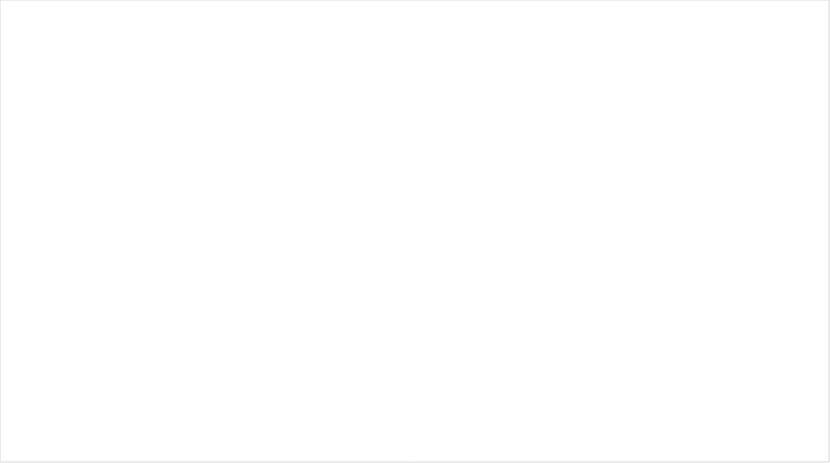
| Category |  APROPIACION
 VIGENTE |  COMPROMISOS
 ACUMULADOS |  OBLIGACIONES
 ACUMULADAS |  PAGOS
 ACUMULADOS |
|---|---|---|---|---|
| A-01 -GASTOS DE PERSONAL | 51464.345 | 31180.193 | 31180.193 | 30274.486 |
| A-02 -ADQUISICIÓN DE BIENES  Y SERVICIOS | 19419.071 | 15898.931 | 11289.798 | 11024.513 |
| A-03-TRANSFERENCIAS CORRIENTES | 14851.097 | 2091.395 | 2091.395 | 2022.507 |
| A-08-GASTOS POR TRIBUTOS, MULTAS, SANCIONES E INTERESES DE MORA | 14051.472 | 0 | 0 | 0 |